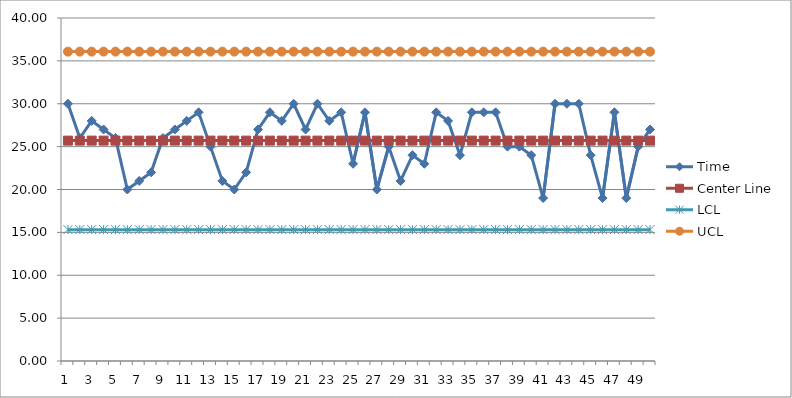
| Category | Time | Center Line | delta from mean (xi - u) | delta from mean squared(xi-u)^2 | LCL | UCL |
|---|---|---|---|---|---|---|
| 0 | 30 | 25.7 |  |  | 15.321 | 36.079 |
| 1 | 26 | 25.7 |  |  | 15.321 | 36.079 |
| 2 | 28 | 25.7 |  |  | 15.321 | 36.079 |
| 3 | 27 | 25.7 |  |  | 15.321 | 36.079 |
| 4 | 26 | 25.7 |  |  | 15.321 | 36.079 |
| 5 | 20 | 25.7 |  |  | 15.321 | 36.079 |
| 6 | 21 | 25.7 |  |  | 15.321 | 36.079 |
| 7 | 22 | 25.7 |  |  | 15.321 | 36.079 |
| 8 | 26 | 25.7 |  |  | 15.321 | 36.079 |
| 9 | 27 | 25.7 |  |  | 15.321 | 36.079 |
| 10 | 28 | 25.7 |  |  | 15.321 | 36.079 |
| 11 | 29 | 25.7 |  |  | 15.321 | 36.079 |
| 12 | 25 | 25.7 |  |  | 15.321 | 36.079 |
| 13 | 21 | 25.7 |  |  | 15.321 | 36.079 |
| 14 | 20 | 25.7 |  |  | 15.321 | 36.079 |
| 15 | 22 | 25.7 |  |  | 15.321 | 36.079 |
| 16 | 27 | 25.7 |  |  | 15.321 | 36.079 |
| 17 | 29 | 25.7 |  |  | 15.321 | 36.079 |
| 18 | 28 | 25.7 |  |  | 15.321 | 36.079 |
| 19 | 30 | 25.7 |  |  | 15.321 | 36.079 |
| 20 | 27 | 25.7 |  |  | 15.321 | 36.079 |
| 21 | 30 | 25.7 |  |  | 15.321 | 36.079 |
| 22 | 28 | 25.7 |  |  | 15.321 | 36.079 |
| 23 | 29 | 25.7 |  |  | 15.321 | 36.079 |
| 24 | 23 | 25.7 |  |  | 15.321 | 36.079 |
| 25 | 29 | 25.7 |  |  | 15.321 | 36.079 |
| 26 | 20 | 25.7 |  |  | 15.321 | 36.079 |
| 27 | 25 | 25.7 |  |  | 15.321 | 36.079 |
| 28 | 21 | 25.7 |  |  | 15.321 | 36.079 |
| 29 | 24 | 25.7 |  |  | 15.321 | 36.079 |
| 30 | 23 | 25.7 |  |  | 15.321 | 36.079 |
| 31 | 29 | 25.7 |  |  | 15.321 | 36.079 |
| 32 | 28 | 25.7 |  |  | 15.321 | 36.079 |
| 33 | 24 | 25.7 |  |  | 15.321 | 36.079 |
| 34 | 29 | 25.7 |  |  | 15.321 | 36.079 |
| 35 | 29 | 25.7 |  |  | 15.321 | 36.079 |
| 36 | 29 | 25.7 |  |  | 15.321 | 36.079 |
| 37 | 25 | 25.7 |  |  | 15.321 | 36.079 |
| 38 | 25 | 25.7 |  |  | 15.321 | 36.079 |
| 39 | 24 | 25.7 |  |  | 15.321 | 36.079 |
| 40 | 19 | 25.7 |  |  | 15.321 | 36.079 |
| 41 | 30 | 25.7 |  |  | 15.321 | 36.079 |
| 42 | 30 | 25.7 |  |  | 15.321 | 36.079 |
| 43 | 30 | 25.7 |  |  | 15.321 | 36.079 |
| 44 | 24 | 25.7 |  |  | 15.321 | 36.079 |
| 45 | 19 | 25.7 |  |  | 15.321 | 36.079 |
| 46 | 29 | 25.7 |  |  | 15.321 | 36.079 |
| 47 | 19 | 25.7 |  |  | 15.321 | 36.079 |
| 48 | 25 | 25.7 |  |  | 15.321 | 36.079 |
| 49 | 27 | 25.7 |  |  | 15.321 | 36.079 |